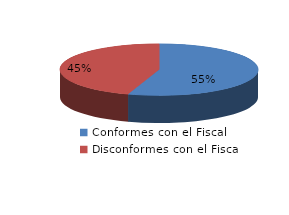
| Category | Series 0 |
|---|---|
| 0 | 461 |
| 1 | 377 |